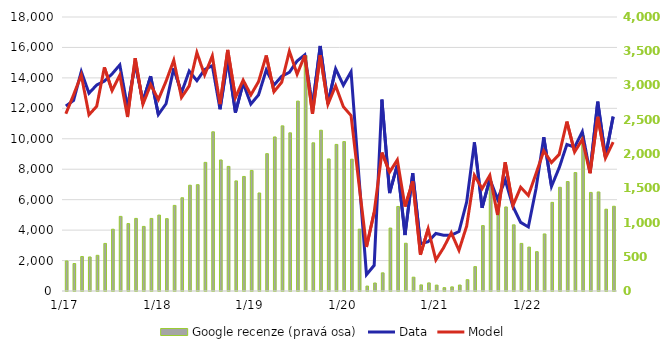
| Category | Google recenze (pravá osa) |
|---|---|
| 2017-01-01 | 438.628 |
| 2017-02-01 | 401.069 |
| 2017-03-01 | 503.268 |
| 2017-04-01 | 496.897 |
| 2017-05-01 | 520.881 |
| 2017-06-01 | 694.406 |
| 2017-07-01 | 901.789 |
| 2017-08-01 | 1089.246 |
| 2017-09-01 | 984.303 |
| 2017-10-01 | 1059.703 |
| 2017-11-01 | 942.785 |
| 2017-12-01 | 1059.284 |
| 2018-01-01 | 1108.536 |
| 2018-02-01 | 1056.265 |
| 2018-03-01 | 1249.633 |
| 2018-04-01 | 1361.141 |
| 2018-05-01 | 1544.185 |
| 2018-06-01 | 1552.037 |
| 2018-07-01 | 1877.827 |
| 2018-08-01 | 2324 |
| 2018-09-01 | 1913 |
| 2018-10-01 | 1819 |
| 2018-11-01 | 1607 |
| 2018-12-01 | 1672 |
| 2019-01-01 | 1760 |
| 2019-02-01 | 1431 |
| 2019-03-01 | 2005 |
| 2019-04-01 | 2249 |
| 2019-05-01 | 2411 |
| 2019-06-01 | 2309 |
| 2019-07-01 | 2772 |
| 2019-08-01 | 3438 |
| 2019-09-01 | 2163 |
| 2019-10-01 | 2347 |
| 2019-11-01 | 1928 |
| 2019-12-01 | 2140 |
| 2020-01-01 | 2181 |
| 2020-02-01 | 1924 |
| 2020-03-01 | 903 |
| 2020-04-01 | 72 |
| 2020-05-01 | 117 |
| 2020-06-01 | 265 |
| 2020-07-01 | 919 |
| 2020-08-01 | 1234 |
| 2020-09-01 | 697 |
| 2020-10-01 | 202 |
| 2020-11-01 | 89 |
| 2020-12-01 | 118 |
| 2021-01-01 | 86 |
| 2021-02-01 | 49 |
| 2021-03-01 | 60 |
| 2021-04-01 | 87 |
| 2021-05-01 | 165 |
| 2021-06-01 | 356 |
| 2021-07-01 | 955 |
| 2021-08-01 | 1602 |
| 2021-09-01 | 1258 |
| 2021-10-01 | 1227 |
| 2021-11-01 | 966 |
| 2021-12-01 | 695 |
| 2022-01-01 | 641 |
| 2022-02-01 | 574 |
| 2022-03-01 | 833 |
| 2022-04-01 | 1294 |
| 2022-05-01 | 1514 |
| 2022-06-01 | 1598 |
| 2022-07-01 | 1729 |
| 2022-08-01 | 2268 |
| 2022-09-01 | 1439 |
| 2022-10-01 | 1446 |
| 2022-11-01 | 1194 |
| 2022-12-01 | 1237 |